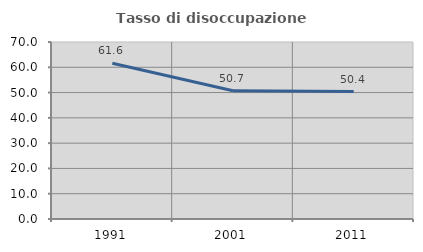
| Category | Tasso di disoccupazione giovanile  |
|---|---|
| 1991.0 | 61.562 |
| 2001.0 | 50.691 |
| 2011.0 | 50.418 |